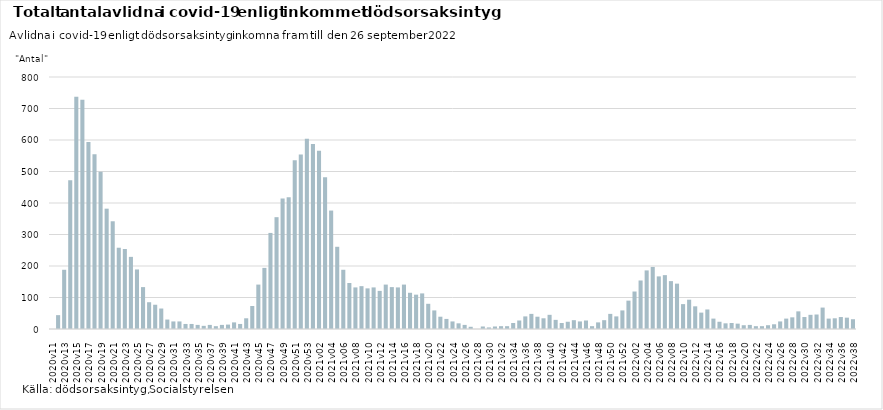
| Category | Series 0 |
|---|---|
| 2020v11 | 0 |
| 2020v12 | 44 |
| 2020v13 | 188 |
| 2020v14 | 472 |
| 2020v15 | 737 |
| 2020v16 | 728 |
| 2020v17 | 594 |
| 2020v18 | 555 |
| 2020v19 | 499 |
| 2020v20 | 382 |
| 2020v21 | 342 |
| 2020v22 | 258 |
| 2020v23 | 254 |
| 2020v24 | 229 |
| 2020v25 | 189 |
| 2020v26 | 133 |
| 2020v27 | 85 |
| 2020v28 | 77 |
| 2020v29 | 65 |
| 2020v30 | 30 |
| 2020v31 | 24 |
| 2020v32 | 24 |
| 2020v33 | 16 |
| 2020v34 | 16 |
| 2020v35 | 13 |
| 2020v36 | 10 |
| 2020v37 | 13 |
| 2020v38 | 9 |
| 2020v39 | 13 |
| 2020v40 | 14 |
| 2020v41 | 21 |
| 2020v42 | 16 |
| 2020v43 | 34 |
| 2020v44 | 73 |
| 2020v45 | 141 |
| 2020v46 | 194 |
| 2020v47 | 305 |
| 2020v48 | 355 |
| 2020v49 | 414 |
| 2020v50 | 418 |
| 2020v51 | 536 |
| 2020v52 | 554 |
| 2020v53 | 604 |
| 2021v01 | 587 |
| 2021v02 | 566 |
| 2021v03 | 482 |
| 2021v04 | 376 |
| 2021v05 | 261 |
| 2021v06 | 188 |
| 2021v07 | 146 |
| 2021v08 | 132 |
| 2021v09 | 136 |
| 2021v10 | 129 |
| 2021v11 | 132 |
| 2021v12 | 121 |
| 2021v13 | 141 |
| 2021v14 | 133 |
| 2021v15 | 132 |
| 2021v16 | 141 |
| 2021v17 | 115 |
| 2021v18 | 109 |
| 2021v19 | 113 |
| 2021v20 | 80 |
| 2021v21 | 59 |
| 2021v22 | 39 |
| 2021v23 | 32 |
| 2021v24 | 24 |
| 2021v25 | 18 |
| 2021v26 | 13 |
| 2021v27 | 7 |
| 2021v28 | 0 |
| 2021v29 | 8 |
| 2021v30 | 5 |
| 2021v31 | 8 |
| 2021v32 | 9 |
| 2021v33 | 9 |
| 2021v34 | 19 |
| 2021v35 | 27 |
| 2021v36 | 40 |
| 2021v37 | 48 |
| 2021v38 | 39 |
| 2021v39 | 34 |
| 2021v40 | 45 |
| 2021v41 | 29 |
| 2021v42 | 19 |
| 2021v43 | 23 |
| 2021v44 | 28 |
| 2021v45 | 24 |
| 2021v46 | 27 |
| 2021v47 | 9 |
| 2021v48 | 21 |
| 2021v49 | 28 |
| 2021v50 | 48 |
| 2021v51 | 40 |
| 2021v52 | 59 |
| 2022v01 | 90 |
| 2022v02 | 119 |
| 2022v03 | 154 |
| 2022v04 | 186 |
| 2022v05 | 197 |
| 2022v06 | 167 |
| 2022v07 | 171 |
| 2022v08 | 152 |
| 2022v09 | 144 |
| 2022v10 | 79 |
| 2022v11 | 93 |
| 2022v12 | 72 |
| 2022v13 | 52 |
| 2022v14 | 62 |
| 2022v15 | 33 |
| 2022v16 | 23 |
| 2022v17 | 18 |
| 2022v18 | 19 |
| 2022v19 | 17 |
| 2022v20 | 12 |
| 2022v21 | 13 |
| 2022v22 | 9 |
| 2022v23 | 9 |
| 2022v24 | 12 |
| 2022v25 | 15 |
| 2022v26 | 24 |
| 2022v27 | 33 |
| 2022v28 | 37 |
| 2022v29 | 56 |
| 2022v30 | 38 |
| 2022v31 | 45 |
| 2022v32 | 46 |
| 2022v33 | 68 |
| 2022v34 | 33 |
| 2022v35 | 34 |
| 2022v36 | 38 |
| 2022v37 | 36 |
| 2022v38 | 31 |